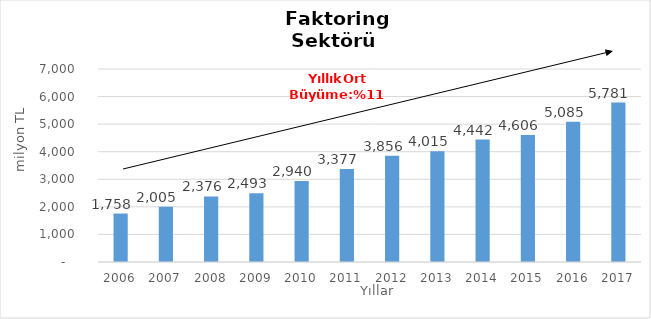
| Category | Faktoring  |
|---|---|
| 2006.0 | 1757.796 |
| 2007.0 | 2005.232 |
| 2008.0 | 2375.996 |
| 2009.0 | 2493.335 |
| 2010.0 | 2940.32 |
| 2011.0 | 3376.552 |
| 2012.0 | 3855.882 |
| 2013.0 | 4014.568 |
| 2014.0 | 4442 |
| 2015.0 | 4606 |
| 2016.0 | 5085 |
| 2017.0 | 5781 |